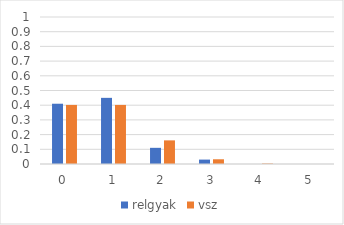
| Category | relgyak | vsz |
|---|---|---|
| 0.0 | 0.41 | 0.402 |
| 1.0 | 0.45 | 0.402 |
| 2.0 | 0.11 | 0.161 |
| 3.0 | 0.03 | 0.032 |
| 4.0 | 0 | 0.003 |
| 5.0 | 0 | 0 |